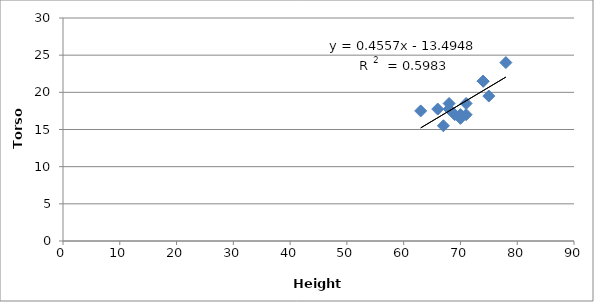
| Category | Torso (Inches) |
|---|---|
| 66.0 | 17.75 |
| 67.0 | 15.5 |
| 70.0 | 16.5 |
| 70.0 | 17 |
| 74.0 | 21.5 |
| 74.0 | 21.5 |
| 63.0 | 17.5 |
| 78.0 | 24 |
| 68.0 | 18.5 |
| 69.0 | 17 |
| 68.0 | 17.75 |
| 75.0 | 19.5 |
| 71.0 | 18.5 |
| 71.0 | 17 |